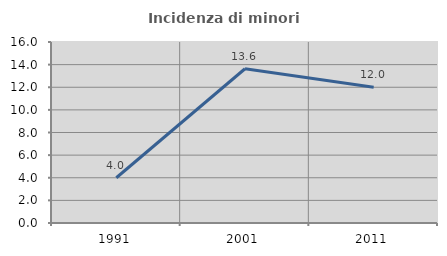
| Category | Incidenza di minori stranieri |
|---|---|
| 1991.0 | 4 |
| 2001.0 | 13.636 |
| 2011.0 | 12 |